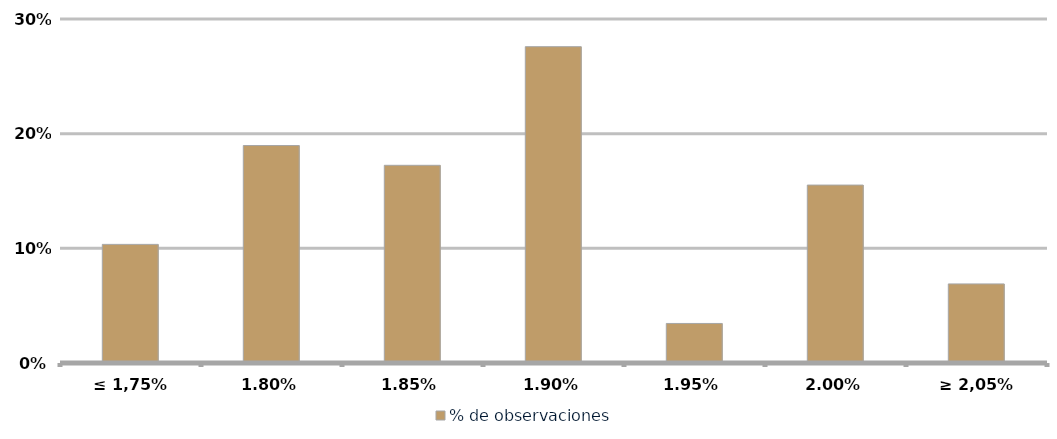
| Category | % de observaciones  |
|---|---|
| ≤ 1,75% | 0.103 |
| 1,80% | 0.19 |
| 1,85% | 0.172 |
| 1,90% | 0.276 |
| 1,95% | 0.034 |
| 2,00% | 0.155 |
| ≥ 2,05% | 0.069 |